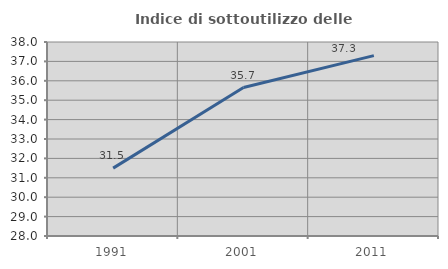
| Category | Indice di sottoutilizzo delle abitazioni  |
|---|---|
| 1991.0 | 31.499 |
| 2001.0 | 35.652 |
| 2011.0 | 37.297 |